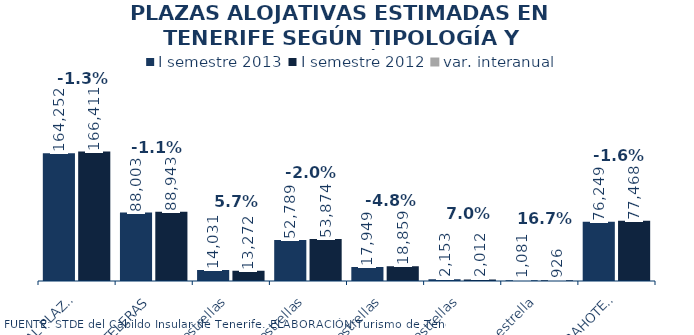
| Category | I semestre 2013 | I semestre 2012 |
|---|---|---|
| TOTAL PLAZAS | 164252 | 166411 |
| HOTELERAS | 88003 | 88943 |
| 5 estrellas | 14031 | 13272 |
| 4 estrellas | 52789 | 53874 |
| 3 estrellas | 17949 | 18859 |
| 2 estrellas | 2153 | 2012 |
| 1 estrella | 1081 | 926 |
| EXTRAHOTELERAS | 76249 | 77468 |